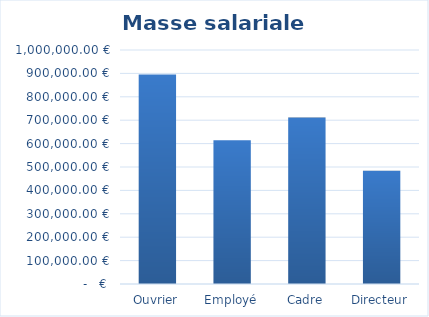
| Category | Masse salariale  |
|---|---|
| Ouvrier | 895423 |
| Employé | 614380 |
| Cadre | 711056 |
| Directeur | 483834 |